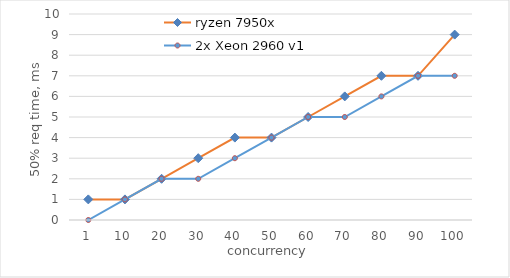
| Category | ryzen 7950x | 2x Xeon 2960 v1 |
|---|---|---|
| 1 | 1 | 0 |
| 10 | 1 | 1 |
| 20 | 2 | 2 |
| 30 | 3 | 2 |
| 40 | 4 | 3 |
| 50 | 4 | 4 |
| 60 | 5 | 5 |
| 70 | 6 | 5 |
| 80 | 7 | 6 |
| 90 | 7 | 7 |
| 100 | 9 | 7 |